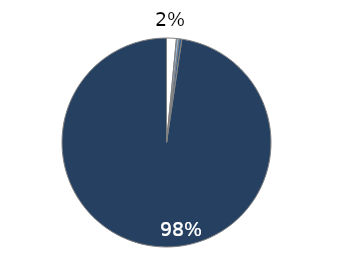
| Category | Road |
|---|---|
| EUR 0   | 0.015 |
| EUR 0-5   | 0.004 |
| EUR 5-30   | 0.004 |
| EUR >30 per tonne of CO2 | 0.976 |